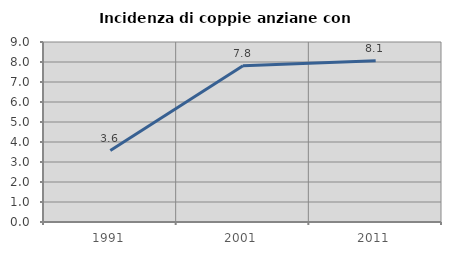
| Category | Incidenza di coppie anziane con figli |
|---|---|
| 1991.0 | 3.571 |
| 2001.0 | 7.812 |
| 2011.0 | 8.065 |